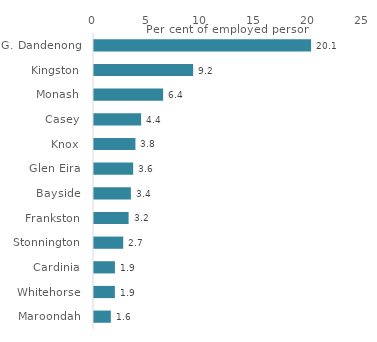
| Category | Series 0 |
|---|---|
| G. Dandenong  | 20.101 |
| Kingston  | 9.179 |
| Monash  | 6.401 |
| Casey  | 4.363 |
| Knox  | 3.836 |
| Glen Eira  | 3.626 |
| Bayside  | 3.417 |
| Frankston  | 3.204 |
| Stonnington  | 2.705 |
| Cardinia  | 1.94 |
| Whitehorse  | 1.932 |
| Maroondah  | 1.557 |